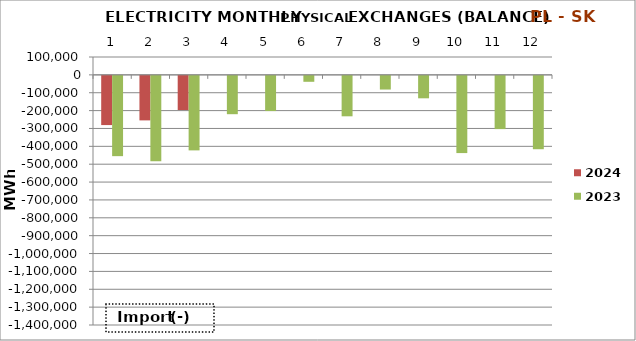
| Category | 2024 | 2023 |
|---|---|---|
| 0 | -275429.5 | -449351.3 |
| 1 | -249197.2 | -477414.3 |
| 2 | -191278.6 | -417082 |
| 3 | 0 | -214525 |
| 4 | 0 | -196891.7 |
| 5 | 0 | -33193 |
| 6 | 0 | -226353.2 |
| 7 | 0 | -76521.9 |
| 8 | 0 | -125607.5 |
| 9 | 0 | -432159.7 |
| 10 | 0 | -297949.2 |
| 11 | 0 | -410570 |